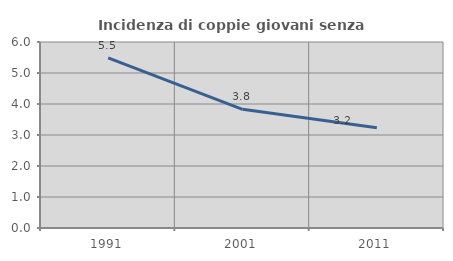
| Category | Incidenza di coppie giovani senza figli |
|---|---|
| 1991.0 | 5.488 |
| 2001.0 | 3.829 |
| 2011.0 | 3.235 |